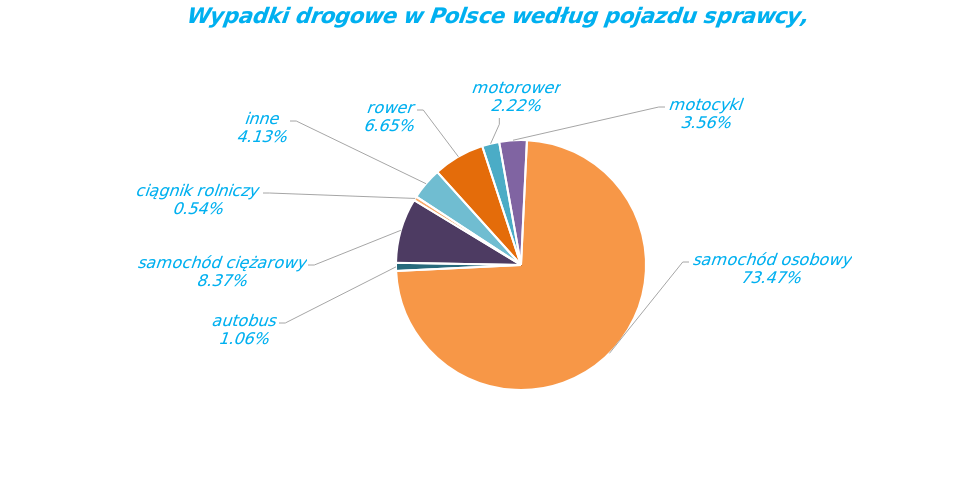
| Category | Series 0 |
|---|---|
| rower | 1396 |
| motorower | 466 |
| motocykl | 747 |
| samochód osobowy | 15429 |
| autobus | 223 |
| samochód ciężarowy | 1758 |
| ciągnik rolniczy | 113 |
| inne | 867 |